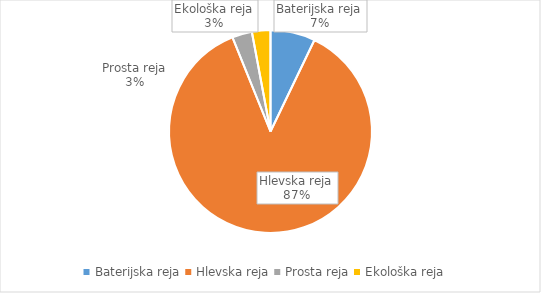
| Category | Količina kosov jajc |
|---|---|
| Baterijska reja | 246721 |
| Hlevska reja | 3002233 |
| Prosta reja | 109647 |
| Ekološka reja | 102008 |